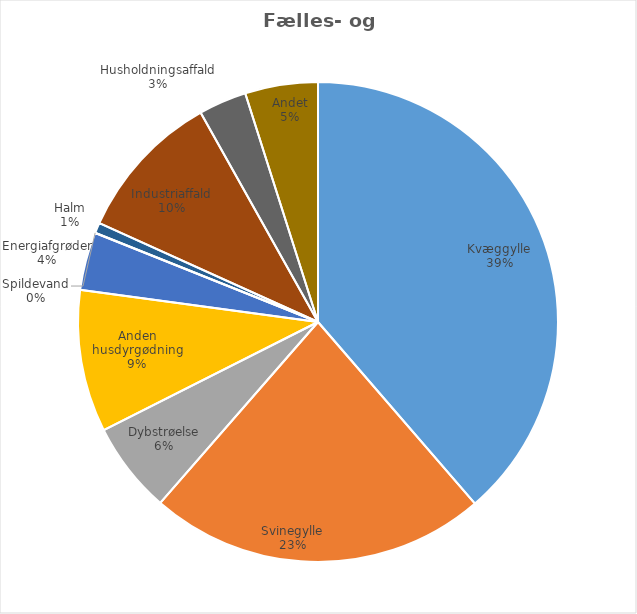
| Category | Series 0 |
|---|---|
| Kvæggylle | 3675241.96 |
| Svinegylle | 2163739.23 |
| Dybstrøelse | 585039.28 |
| Anden husdyrgødning | 910575.05 |
| Energiafgrøder | 371759.346 |
| Spildevand | 1271.16 |
| Halm | 66177.9 |
| Industriaffald | 961432.442 |
| Husholdningsaffald | 306820.41 |
| Andet | 466245.357 |